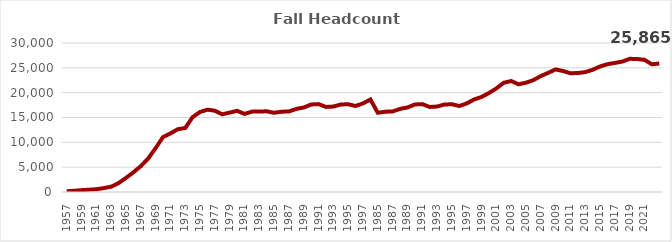
| Category | Headcount Enrollment |
|---|---|
| 1957 | 148 |
| 1958 | 245 |
| 1959 | 369 |
| 1960 | 468 |
| 1961 | 559 |
| 1962 | 782 |
| 1963 | 1065 |
| 1964 | 1789 |
| 1965 | 2837 |
| 1966 | 3952 |
| 1967 | 5199 |
| 1968 | 6739 |
| 1969 | 8825 |
| 1970 | 11062 |
| 1971 | 11795 |
| 1972 | 12644 |
| 1973 | 12883 |
| 1974 | 15083 |
| 1975 | 16110 |
| 1976 | 16571 |
| 1977 | 16361 |
| 1978 | 15643 |
| 1979 | 15984 |
| 1980 | 16347 |
| 1981 | 15723 |
| 1982 | 16181 |
| 1983 | 16207 |
| 1984 | 16248 |
| 1985 | 15949 |
| 1986 | 16166 |
| 1987 | 16222 |
| 1988 | 16728 |
| 1989 | 17012 |
| 1990 | 17624 |
| 1991 | 17696 |
| 1992 | 17125 |
| 1993 | 17205 |
| 1994 | 17621 |
| 1995 | 17665 |
| 1996 | 17316 |
| 1997 | 17831 |
| 1998 | 18628 |
| 1985 | 15949 |
| 1986 | 16166 |
| 1987 | 16222 |
| 1988 | 16728 |
| 1989 | 17012 |
| 1990 | 17624 |
| 1991 | 17696 |
| 1992 | 17125 |
| 1993 | 17205 |
| 1994 | 17621 |
| 1995 | 17665 |
| 1996 | 17316 |
| 1997 | 17831 |
| 1998 | 18628 |
| 1999 | 19139 |
| 2000 | 19924 |
| 2001 | 20855 |
| 2002 | 21989 |
| 2003 | 22344 |
| 2004 | 21685 |
| 2005 | 22011 |
| 2006 | 22522 |
| 2007 | 23347 |
| 2008 | 23991 |
| 2009 | 24681 |
| 2010 | 24363 |
| 2011 | 23920 |
| 2012 | 23946 |
| 2013 | 24143 |
| 2014 | 24607 |
| 2015 | 25272 |
| 2016 | 25734 |
| 2017 | 25989 |
| 2018 | 26256 |
| 2019 | 26814 |
| 2020 | 26782 |
| 2021 | 26608 |